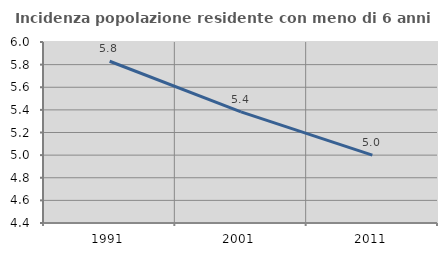
| Category | Incidenza popolazione residente con meno di 6 anni |
|---|---|
| 1991.0 | 5.83 |
| 2001.0 | 5.383 |
| 2011.0 | 5 |